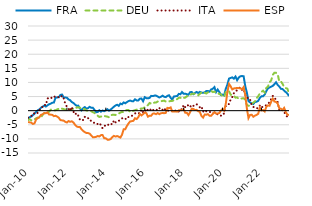
| Category | FRA | DEU | ITA | ESP |
|---|---|---|---|---|
| 2010-01-01 | -2.837 | -3.387 | -2.478 | -4.024 |
| 2010-02-01 | -2.33 | -3.018 | -2.293 | -4.141 |
| 2010-03-01 | -2.093 | -3.398 | -1.808 | -4.228 |
| 2010-04-01 | -1.593 | -3.393 | -1.804 | -4.713 |
| 2010-05-01 | -1.066 | -3.092 | -0.719 | -4.518 |
| 2010-06-01 | -0.421 | -2.708 | -0.691 | -3.108 |
| 2010-07-01 | 0.146 | -2.45 | -0.831 | -2.633 |
| 2010-08-01 | 0.443 | -2.614 | 0.014 | -2.332 |
| 2010-09-01 | 1.053 | -2.406 | 1.166 | -1.474 |
| 2010-10-01 | 1.406 | -1.516 | 1.302 | -1.291 |
| 2010-11-01 | 1.788 | -0.956 | 2.13 | -0.835 |
| 2010-12-01 | 1.462 | -0.76 | 1.942 | -0.893 |
| 2011-01-01 | 1.881 | -0.855 | 4.238 | -0.608 |
| 2011-02-01 | 2.265 | -0.338 | 4.717 | -1.375 |
| 2011-03-01 | 2.486 | 0.337 | 4.697 | -1.407 |
| 2011-04-01 | 2.818 | 0.451 | 4.326 | -1.5 |
| 2011-05-01 | 2.885 | 0.093 | 4.909 | -1.929 |
| 2011-06-01 | 4.679 | 0.173 | 5.068 | -1.821 |
| 2011-07-01 | 4.689 | 0.457 | 4.826 | -2.108 |
| 2011-08-01 | 4.742 | 0.632 | 4.797 | -2.517 |
| 2011-09-01 | 5.586 | 0.96 | 4.576 | -3.341 |
| 2011-10-01 | 5.718 | 0.691 | 5.317 | -3.437 |
| 2011-11-01 | 4.686 | 0.563 | 4.339 | -3.529 |
| 2011-12-01 | 4.668 | 0.314 | 2.469 | -3.968 |
| 2012-01-01 | 4.589 | 0.757 | 1.348 | -4.182 |
| 2012-02-01 | 3.975 | 0.474 | 0.695 | -3.691 |
| 2012-03-01 | 3.689 | 0.412 | -0.101 | -3.946 |
| 2012-04-01 | 3.059 | 0.361 | 1.35 | -3.753 |
| 2012-05-01 | 2.724 | 0.749 | -0.308 | -4.173 |
| 2012-06-01 | 2.183 | 0.685 | -1.379 | -4.977 |
| 2012-07-01 | 1.721 | 1.139 | -0.855 | -5.584 |
| 2012-08-01 | 1.781 | 1.18 | -1.788 | -5.79 |
| 2012-09-01 | 0.841 | 1.051 | -3.128 | -5.77 |
| 2012-10-01 | 0.129 | 0.62 | -2.884 | -6.583 |
| 2012-11-01 | 0.841 | 0.67 | -3.359 | -7.179 |
| 2012-12-01 | 1.258 | 0.576 | -2.165 | -7.587 |
| 2013-01-01 | 0.727 | 0.079 | -2.778 | -7.905 |
| 2013-02-01 | 0.878 | -0.036 | -2.667 | -7.946 |
| 2013-03-01 | 1.357 | 0.004 | -2.759 | -8.128 |
| 2013-04-01 | 1.045 | -0.214 | -3.793 | -8.779 |
| 2013-05-01 | 1.029 | -0.534 | -3.922 | -9.4 |
| 2013-06-01 | 0.294 | -0.788 | -4.394 | -9.38 |
| 2013-07-01 | -0.53 | -1.458 | -4.295 | -9.288 |
| 2013-08-01 | -0.493 | -1.802 | -4.76 | -8.985 |
| 2013-09-01 | 0.129 | -2.237 | -4.374 | -9.144 |
| 2013-10-01 | -0.349 | -2.076 | -5.134 | -8.669 |
| 2013-11-01 | 0.066 | -2.199 | -6.266 | -8.631 |
| 2013-12-01 | -0.197 | -1.874 | -5.494 | -9.765 |
| 2014-01-01 | 0.098 | -1.999 | -5.116 | -9.792 |
| 2014-02-01 | 0.496 | -2.115 | -5.325 | -10.276 |
| 2014-03-01 | -0.003 | -2.344 | -4.579 | -10.274 |
| 2014-04-01 | 0.407 | -1.666 | -4.595 | -10.069 |
| 2014-05-01 | 0.879 | -1.474 | -4.897 | -9.36 |
| 2014-06-01 | 1.401 | -1.461 | -3.396 | -8.933 |
| 2014-07-01 | 1.841 | -1.535 | -4.14 | -9.17 |
| 2014-08-01 | 2.092 | -1.092 | -4.057 | -8.987 |
| 2014-09-01 | 1.701 | -1.001 | -3.573 | -9.246 |
| 2014-10-01 | 2.512 | -0.683 | -3.346 | -9.537 |
| 2014-11-01 | 2.267 | -0.426 | -2.737 | -8.502 |
| 2014-12-01 | 2.918 | -0.537 | -2.458 | -6.611 |
| 2015-01-01 | 2.599 | 0.025 | -2.867 | -6.566 |
| 2015-02-01 | 3.05 | 0.237 | -3.064 | -5.44 |
| 2015-03-01 | 3.377 | 0.22 | -2.215 | -4.532 |
| 2015-04-01 | 3.596 | -0.465 | -2.198 | -3.821 |
| 2015-05-01 | 3.372 | -0.159 | -1.87 | -3.721 |
| 2015-06-01 | 3.345 | -0.036 | -1.496 | -3.597 |
| 2015-07-01 | 4.033 | 0.184 | -0.988 | -2.684 |
| 2015-08-01 | 3.637 | 0.341 | -0.707 | -2.955 |
| 2015-09-01 | 3.615 | 0.554 | -0.801 | -2.365 |
| 2015-10-01 | 4.237 | 0.683 | -1.008 | -1.148 |
| 2015-11-01 | 4.307 | 0.755 | 0.385 | -1.689 |
| 2015-12-01 | 3.347 | 0.811 | -0.501 | -1.21 |
| 2016-01-01 | 4.791 | 1.231 | -0.693 | -0.652 |
| 2016-02-01 | 4.432 | 1.59 | 0.749 | -0.882 |
| 2016-03-01 | 4.364 | 1.993 | 0.142 | -2.147 |
| 2016-04-01 | 4.529 | 2.726 | -0.16 | -1.778 |
| 2016-05-01 | 5.243 | 2.475 | 0.794 | -1.767 |
| 2016-06-01 | 5.166 | 2.488 | 0.365 | -1.054 |
| 2016-07-01 | 5.334 | 2.875 | -0.036 | -0.995 |
| 2016-08-01 | 5.335 | 2.878 | 0.32 | -1.24 |
| 2016-09-01 | 5.031 | 3.231 | 0.246 | -0.858 |
| 2016-10-01 | 4.651 | 3.262 | 0.981 | -1.244 |
| 2016-11-01 | 4.937 | 3.301 | 0.191 | -0.91 |
| 2016-12-01 | 5.309 | 3.462 | 0.328 | -0.831 |
| 2017-01-01 | 4.924 | 3.56 | 0.96 | -0.894 |
| 2017-02-01 | 4.795 | 3.236 | -0.011 | -0.79 |
| 2017-03-01 | 5.249 | 3.195 | 0.012 | 0.984 |
| 2017-04-01 | 5.465 | 3.294 | 0.016 | 0.863 |
| 2017-05-01 | 4.542 | 3.416 | 0.155 | 1.157 |
| 2017-06-01 | 3.996 | 3.454 | -0.122 | -0.296 |
| 2017-07-01 | 5.01 | 3.705 | 0.334 | -0.29 |
| 2017-08-01 | 5.123 | 3.764 | -0.033 | -0.275 |
| 2017-09-01 | 5.182 | 4.098 | -0.512 | -0.352 |
| 2017-10-01 | 5.939 | 4.532 | -0.258 | 0.112 |
| 2017-11-01 | 5.827 | 4.57 | 0.57 | 0.103 |
| 2017-12-01 | 6.611 | 4.239 | 0.433 | 0.218 |
| 2018-01-01 | 5.962 | 4.545 | 2.051 | 0.533 |
| 2018-02-01 | 6.025 | 4.626 | 1.222 | -0.728 |
| 2018-03-01 | 5.832 | 5.152 | 1.201 | -0.805 |
| 2018-04-01 | 5.658 | 5.044 | 2.237 | -1.555 |
| 2018-05-01 | 6.546 | 5.51 | 1.681 | -0.506 |
| 2018-06-01 | 6.623 | 5.957 | 1.143 | 0.667 |
| 2018-07-01 | 5.851 | 6.024 | 1.713 | 0.605 |
| 2018-08-01 | 6.264 | 6.018 | 1.785 | 0.23 |
| 2018-09-01 | 6.638 | 5.872 | 2.301 | 0.285 |
| 2018-10-01 | 6.26 | 5.469 | 1.756 | -0.185 |
| 2018-11-01 | 6.657 | 5.925 | 1.159 | -0.459 |
| 2018-12-01 | 6.394 | 6.47 | 1.527 | -1.869 |
| 2019-01-01 | 6.349 | 6.084 | -0.36 | -2.466 |
| 2019-02-01 | 6.477 | 6.314 | 0.265 | -1.37 |
| 2019-03-01 | 6.973 | 6.07 | -0.225 | -1.426 |
| 2019-04-01 | 6.974 | 6.496 | -0.245 | -1.236 |
| 2019-05-01 | 6.746 | 6.66 | -0.317 | -1.803 |
| 2019-06-01 | 7.515 | 7.024 | -0.851 | -1.819 |
| 2019-07-01 | 7.768 | 6.581 | -0.774 | -1.116 |
| 2019-08-01 | 8.327 | 6.758 | -1.007 | -0.502 |
| 2019-09-01 | 6.564 | 6.387 | -1.257 | -0.99 |
| 2019-10-01 | 7.478 | 6.343 | -1.272 | -1.023 |
| 2019-11-01 | 6.627 | 5.871 | -1.643 | -0.833 |
| 2019-12-01 | 5.559 | 5.805 | -1.787 | 0.016 |
| 2020-01-01 | 5.696 | 5.014 | -0.983 | 0.617 |
| 2020-02-01 | 5.408 | 4.899 | -1.093 | -0.032 |
| 2020-03-01 | 7.75 | 6.598 | 1.734 | 2.401 |
| 2020-04-01 | 9.248 | 7.018 | 2.213 | 6.611 |
| 2020-05-01 | 11.372 | 6.867 | 2.339 | 9.469 |
| 2020-06-01 | 11.598 | 5.658 | 3.931 | 8.65 |
| 2020-07-01 | 11.798 | 5.622 | 4.78 | 7.534 |
| 2020-08-01 | 11.338 | 5.264 | 6.172 | 7.862 |
| 2020-09-01 | 12.089 | 4.612 | 6.936 | 7.977 |
| 2020-10-01 | 10.803 | 4.697 | 7.222 | 8.012 |
| 2020-11-01 | 11.732 | 4.194 | 7.858 | 7.987 |
| 2020-12-01 | 12.189 | 4.204 | 8.297 | 7.911 |
| 2021-01-01 | 12.264 | 4.346 | 7.379 | 7.587 |
| 2021-02-01 | 12.211 | 4.387 | 7.624 | 8.355 |
| 2021-03-01 | 8.741 | 3.931 | 5.719 | 5.614 |
| 2021-04-01 | 6.47 | 2.066 | 4.467 | 0.867 |
| 2021-05-01 | 3.379 | 1.764 | 4.652 | -2.634 |
| 2021-06-01 | 2.924 | 1.745 | 3.901 | -1.51 |
| 2021-07-01 | 2.632 | 2.453 | 1.849 | -1.429 |
| 2021-08-01 | 2.372 | 2.829 | 1.365 | -2.157 |
| 2021-09-01 | 3.08 | 3.3 | 0.936 | -1.742 |
| 2021-10-01 | 3.158 | 4.406 | 0.921 | -1.517 |
| 2021-11-01 | 3.474 | 5.088 | 0.807 | -1.129 |
| 2021-12-01 | 4.501 | 6.107 | 1.847 | 1.068 |
| 2022-01-01 | 5.084 | 6.649 | 1.071 | 0.084 |
| 2022-02-01 | 5.096 | 7.073 | 1.504 | 0.248 |
| 2022-03-01 | 5.692 | 6.432 | 1.649 | -0.296 |
| 2022-04-01 | 6.931 | 8.068 | 1.952 | 1.325 |
| 2022-05-01 | 7.897 | 8.498 | 2.542 | 1.862 |
| 2022-06-01 | 8.211 | 10.053 | 2.93 | 1.743 |
| 2022-07-01 | 8.487 | 10.702 | 4.178 | 3.156 |
| 2022-08-01 | 8.783 | 12.709 | 5.226 | 4.252 |
| 2022-09-01 | 9.362 | 13.444 | 4.88 | 3.229 |
| 2022-10-01 | 10.063 | 13.404 | 3.615 | 3.117 |
| 2022-11-01 | 9.109 | 12.983 | 3.063 | 2.54 |
| 2022-12-01 | 8.576 | 10.328 | 0.157 | 0.809 |
| 2023-01-01 | 7.753 | 10.404 | 0.639 | 0.708 |
| 2023-02-01 | 7.66 | 9.516 | 0.013 | 0.221 |
| 2023-03-01 | 7.098 | 8.381 | -0.499 | 0.989 |
| 2023-04-01 | 6.582 | 8.01 | -1.348 | -0.473 |
| 2023-05-01 | 6.035 | 7.791 | -2.301 | -1.41 |
| 2023-06-01 | 5.166 | 6.168 | -2.911 | -1.551 |